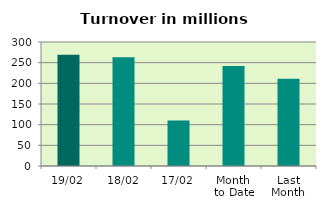
| Category | Series 0 |
|---|---|
| 19/02 | 268.937 |
| 18/02 | 263.336 |
| 17/02 | 110.302 |
| Month 
to Date | 241.752 |
| Last
Month | 211.344 |